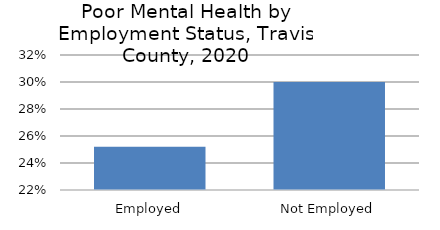
| Category | Series 0 |
|---|---|
| Employed | 0.252 |
| Not Employed | 0.3 |